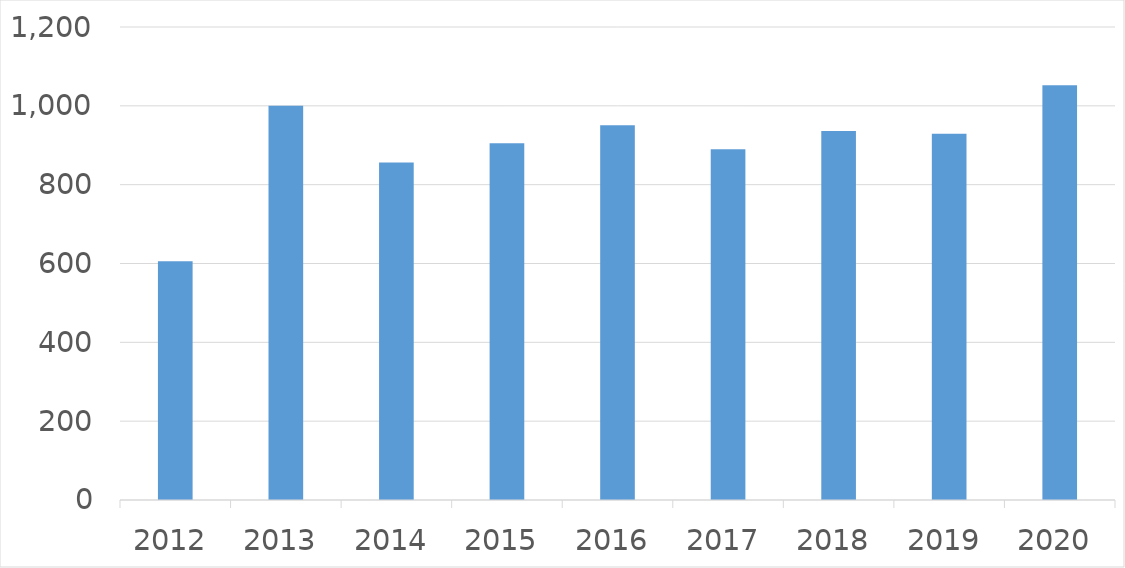
| Category | Series 0 |
|---|---|
| 2012 | 606 |
| 2013 | 1000 |
| 2014 | 856 |
| 2015 | 905 |
| 2016 | 951 |
| 2017 | 890 |
| 2018 | 936 |
| 2019 | 929 |
| 2020 | 1052 |